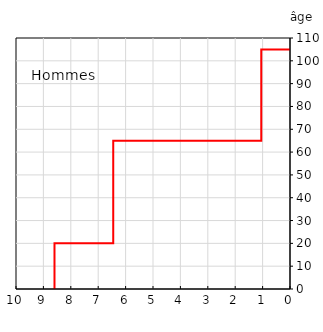
| Category | Hommes |
|---|---|
| -8.595253367543297 | 0 |
| -8.595253367543297 | 20 |
| -6.451428978690044 | 20 |
| -6.451428978690044 | 65 |
| -1.048749198203977 | 65 |
| -1.048749198203977 | 105 |
| 0.0 | 105 |